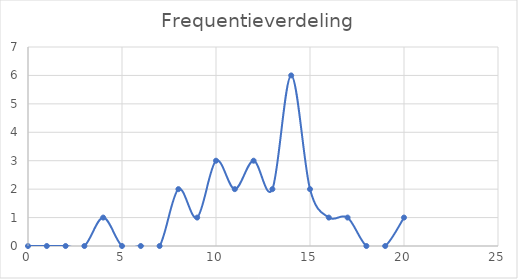
| Category | Aantal |
|---|---|
| 0.0 | 0 |
| 1.0 | 0 |
| 2.0 | 0 |
| 3.0 | 0 |
| 4.0 | 1 |
| 5.0 | 0 |
| 6.0 | 0 |
| 7.0 | 0 |
| 8.0 | 2 |
| 9.0 | 1 |
| 10.0 | 3 |
| 11.0 | 2 |
| 12.0 | 3 |
| 13.0 | 2 |
| 14.0 | 6 |
| 15.0 | 2 |
| 16.0 | 1 |
| 17.0 | 1 |
| 18.0 | 0 |
| 19.0 | 0 |
| 20.0 | 1 |